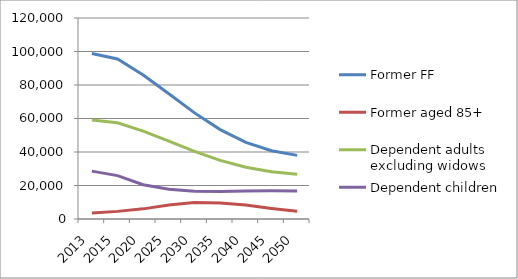
| Category | Former FF | Former aged 85+ | Dependent adults excluding widows | Dependent children |
|---|---|---|---|---|
| 2013.0 | 98850 | 3610 | 59150 | 28580 |
| 2015.0 | 95570 | 4550 | 57470 | 25890 |
| 2020.0 | 85920 | 6050 | 52440 | 20450 |
| 2025.0 | 74800 | 8400 | 46520 | 17720 |
| 2030.0 | 63350 | 9880 | 40380 | 16530 |
| 2035.0 | 53380 | 9590 | 35000 | 16370 |
| 2040.0 | 45780 | 8300 | 30890 | 16650 |
| 2045.0 | 40790 | 6300 | 28190 | 16810 |
| 2050.0 | 37980 | 4610 | 26670 | 16770 |